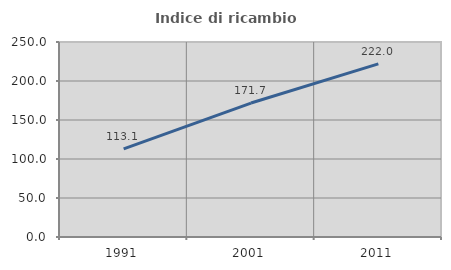
| Category | Indice di ricambio occupazionale  |
|---|---|
| 1991.0 | 113.065 |
| 2001.0 | 171.739 |
| 2011.0 | 222 |